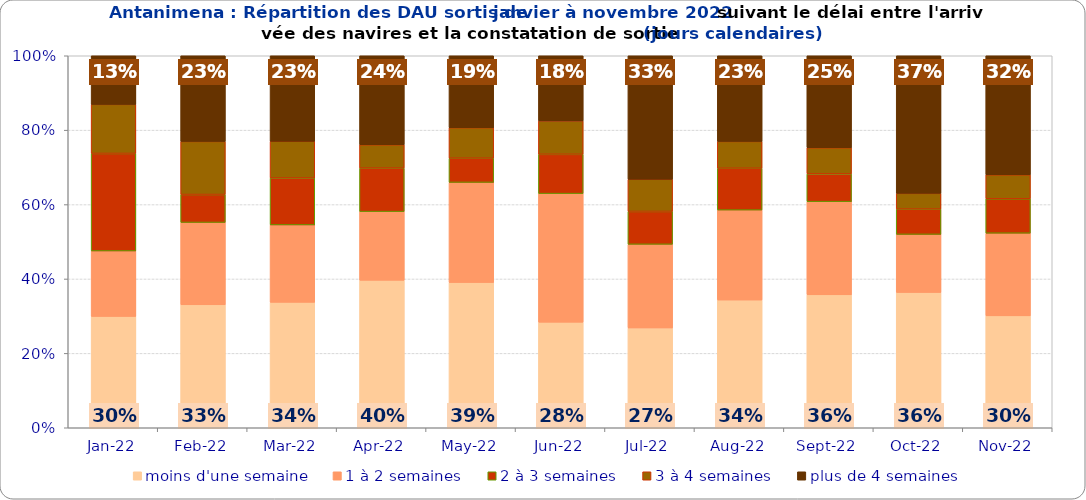
| Category | moins d'une semaine | 1 à 2 semaines | 2 à 3 semaines | 3 à 4 semaines | plus de 4 semaines |
|---|---|---|---|---|---|
| 2022-01-01 | 0.299 | 0.176 | 0.262 | 0.132 | 0.131 |
| 2022-02-01 | 0.331 | 0.221 | 0.075 | 0.143 | 0.23 |
| 2022-03-01 | 0.337 | 0.208 | 0.126 | 0.099 | 0.23 |
| 2022-04-01 | 0.396 | 0.185 | 0.117 | 0.063 | 0.239 |
| 2022-05-01 | 0.39 | 0.269 | 0.065 | 0.082 | 0.193 |
| 2022-06-01 | 0.284 | 0.346 | 0.106 | 0.09 | 0.175 |
| 2022-07-01 | 0.268 | 0.225 | 0.088 | 0.087 | 0.332 |
| 2022-08-01 | 0.343 | 0.242 | 0.112 | 0.072 | 0.23 |
| 2022-09-01 | 0.357 | 0.25 | 0.075 | 0.07 | 0.247 |
| 2022-10-01 | 0.364 | 0.156 | 0.068 | 0.042 | 0.37 |
| 2022-11-01 | 0.301 | 0.222 | 0.092 | 0.065 | 0.32 |